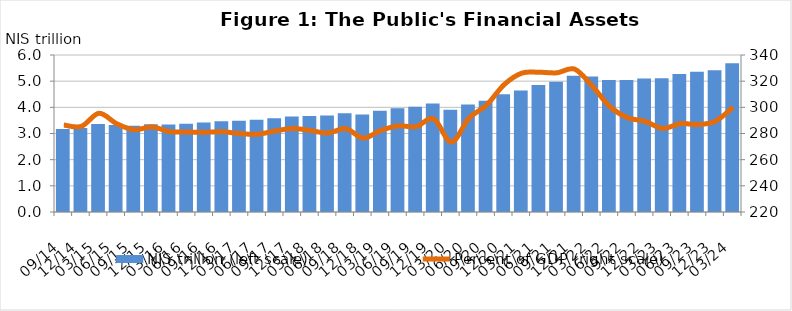
| Category | NIS trillion (left scale) |
|---|---|
| 2014-09-30 | 3173.23 |
| 2014-12-31 | 3207.94 |
| 2015-03-31 | 3367.44 |
| 2015-06-30 | 3321.99 |
| 2015-09-30 | 3298.19 |
| 2015-12-31 | 3353.84 |
| 2016-03-31 | 3340.48 |
| 2016-06-30 | 3368.76 |
| 2016-09-30 | 3425.15 |
| 2016-12-31 | 3468.63 |
| 2017-03-31 | 3487.27 |
| 2017-06-30 | 3521.63 |
| 2017-09-30 | 3580.83 |
| 2017-12-31 | 3649.56 |
| 2018-03-31 | 3670.75 |
| 2018-06-30 | 3683.17 |
| 2018-09-30 | 3769.19 |
| 2018-12-31 | 3724.31 |
| 2019-03-31 | 3865.92 |
| 2019-06-30 | 3960.61 |
| 2019-09-30 | 4019.86 |
| 2019-12-31 | 4148.34 |
| 2020-03-31 | 3906.33 |
| 2020-06-30 | 4107.28 |
| 2020-09-30 | 4247.83 |
| 2020-12-31 | 4498.51 |
| 2021-03-31 | 4643.94 |
| 2021-06-30 | 4854.91 |
| 2021-09-30 | 4974.76 |
| 2021-12-31 | 5207.47 |
| 2022-03-31 | 5176.85 |
| 2022-06-30 | 5048.9 |
| 2022-09-30 | 5046.09 |
| 2022-12-31 | 5102.55 |
| 2023-03-31 | 5114 |
| 2023-06-30 | 5276.98 |
| 2023-09-30 | 5362.11 |
| 2023-12-31 | 5412.75 |
| 2024-03-31 | 5681.45 |